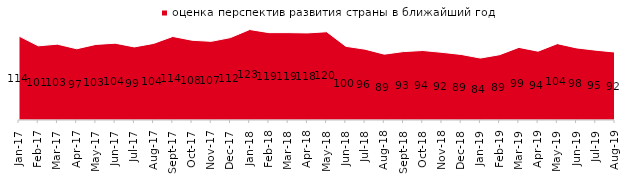
| Category | оценка перспектив развития страны в ближайший год |
|---|---|
| 2017-01-01 | 114 |
| 2017-02-01 | 100.75 |
| 2017-03-01 | 103.05 |
| 2017-04-01 | 96.75 |
| 2017-05-01 | 102.7 |
| 2017-06-01 | 104.35 |
| 2017-07-01 | 99.3 |
| 2017-08-01 | 104.05 |
| 2017-09-01 | 113.5 |
| 2017-10-01 | 108.35 |
| 2017-11-01 | 106.85 |
| 2017-12-01 | 111.95 |
| 2018-01-01 | 122.9 |
| 2018-02-01 | 118.7 |
| 2018-03-01 | 118.7 |
| 2018-04-01 | 118.3 |
| 2018-05-01 | 119.9 |
| 2018-06-01 | 100.1 |
| 2018-07-01 | 96.2 |
| 2018-08-01 | 89.45 |
| 2018-09-01 | 92.95 |
| 2018-10-01 | 94.4 |
| 2018-11-01 | 91.916 |
| 2018-12-01 | 89.05 |
| 2019-01-01 | 84.15 |
| 2019-02-01 | 88.75 |
| 2019-03-01 | 98.657 |
| 2019-04-01 | 93.515 |
| 2019-05-01 | 103.764 |
| 2019-06-01 | 97.955 |
| 2019-07-01 | 94.851 |
| 2019-08-01 | 92.308 |